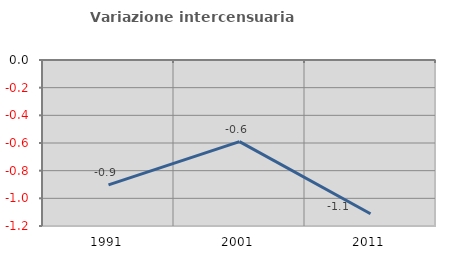
| Category | Variazione intercensuaria annua |
|---|---|
| 1991.0 | -0.903 |
| 2001.0 | -0.59 |
| 2011.0 | -1.111 |